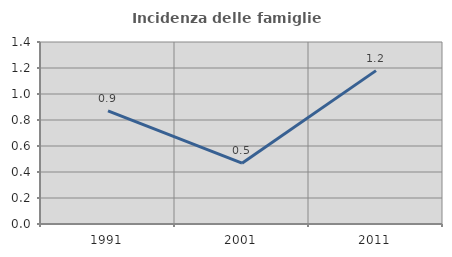
| Category | Incidenza delle famiglie numerose |
|---|---|
| 1991.0 | 0.87 |
| 2001.0 | 0.468 |
| 2011.0 | 1.18 |